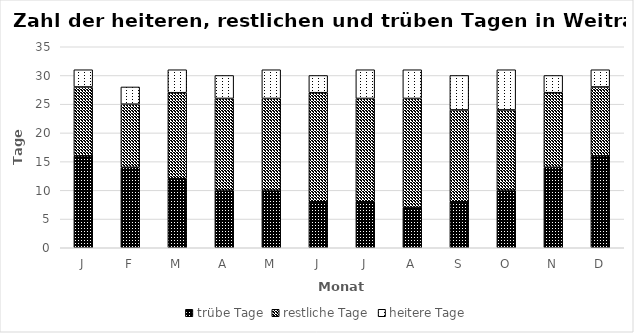
| Category | trübe Tage | restliche Tage | heitere Tage |
|---|---|---|---|
| J | 16 | 12 | 3 |
| F | 14 | 11 | 3 |
| M | 12 | 15 | 4 |
| A | 10 | 16 | 4 |
| M | 10 | 16 | 5 |
| J | 8 | 19 | 3 |
| J | 8 | 18 | 5 |
| A | 7 | 19 | 5 |
| S | 8 | 16 | 6 |
| O | 10 | 14 | 7 |
| N | 14 | 13 | 3 |
| D | 16 | 12 | 3 |